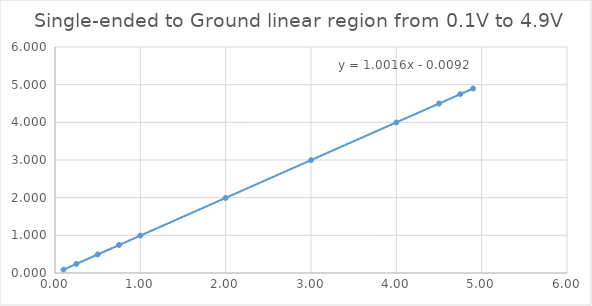
| Category | Series 0 |
|---|---|
| 4.9 | 4.898 |
| 4.75 | 4.749 |
| 4.5 | 4.498 |
| 4.0 | 3.997 |
| 3.0 | 2.995 |
| 2.0 | 1.994 |
| 1.0 | 0.993 |
| 0.75 | 0.742 |
| 0.5 | 0.492 |
| 0.25 | 0.241 |
| 0.1 | 0.091 |